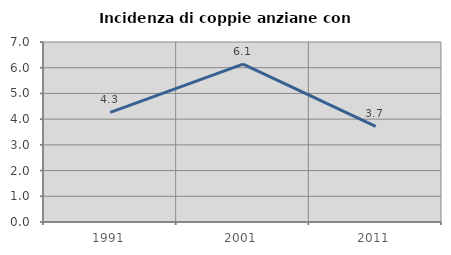
| Category | Incidenza di coppie anziane con figli |
|---|---|
| 1991.0 | 4.262 |
| 2001.0 | 6.14 |
| 2011.0 | 3.722 |